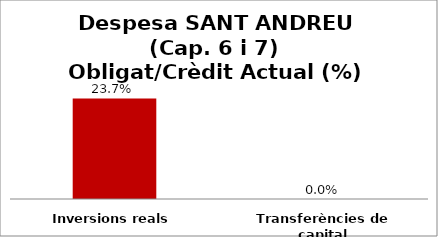
| Category | Series 0 |
|---|---|
| Inversions reals | 0.237 |
| Transferències de capital | 0 |